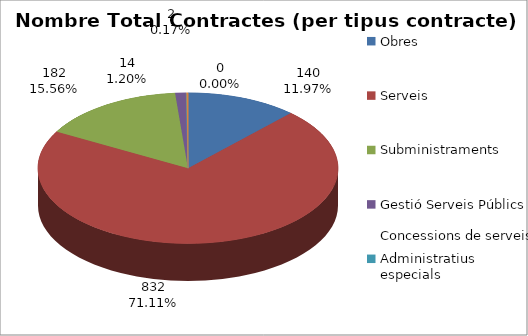
| Category | TOTALS per tipus contracte Nombre Total Contractes | TOTALS per tipus contracte % total contractes | TOTALS per tipus contracte Total Import (€) | TOTALS per tipus contracte % total import |
|---|---|---|---|---|
| Obres | 140 | 0.12 | 6179321.71 | 0.07 |
| Serveis | 832 | 0.711 | 69333094.45 | 0.789 |
| Subministraments | 182 | 0.156 | 11670768.61 | 0.133 |
| Gestió Serveis Públics / 
Concessions de serveis | 14 | 0.012 | 611325.34 | 0.007 |
| Administratius especials | 0 | 0 | 0 | 0 |
| Privats de l'Administració | 2 | 0.002 | 39888.4 | 0 |